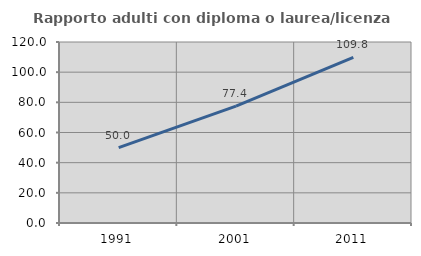
| Category | Rapporto adulti con diploma o laurea/licenza media  |
|---|---|
| 1991.0 | 50 |
| 2001.0 | 77.439 |
| 2011.0 | 109.804 |